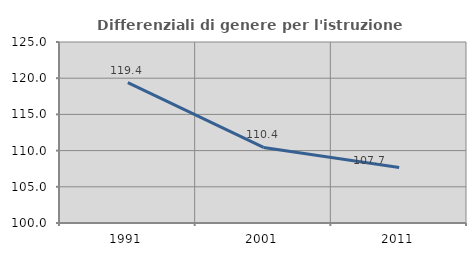
| Category | Differenziali di genere per l'istruzione superiore |
|---|---|
| 1991.0 | 119.388 |
| 2001.0 | 110.441 |
| 2011.0 | 107.656 |